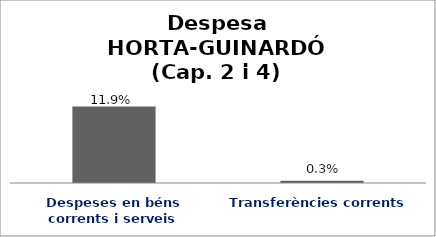
| Category | Series 0 |
|---|---|
| Despeses en béns corrents i serveis | 0.119 |
| Transferències corrents | 0.003 |